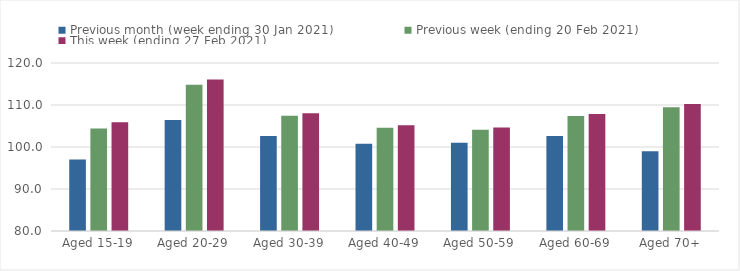
| Category | Previous month (week ending 30 Jan 2021) | Previous week (ending 20 Feb 2021) | This week (ending 27 Feb 2021) |
|---|---|---|---|
| Aged 15-19 | 97.04 | 104.4 | 105.88 |
| Aged 20-29 | 106.42 | 114.85 | 116.06 |
| Aged 30-39 | 102.63 | 107.44 | 108.06 |
| Aged 40-49 | 100.76 | 104.58 | 105.19 |
| Aged 50-59 | 100.99 | 104.11 | 104.65 |
| Aged 60-69 | 102.6 | 107.36 | 107.84 |
| Aged 70+ | 98.99 | 109.44 | 110.22 |